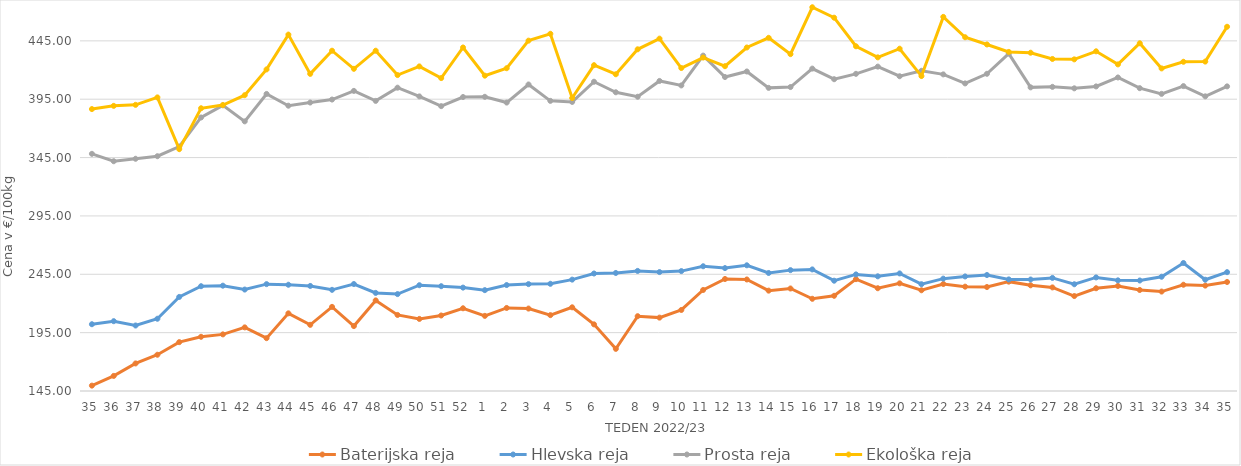
| Category | Baterijska reja | Hlevska reja | Prosta reja | Ekološka reja |
|---|---|---|---|---|
| 35.0 | 149.6 | 202.21 | 348.2 | 386.55 |
| 36.0 | 157.93 | 204.81 | 341.85 | 389.31 |
| 37.0 | 168.61 | 201.11 | 343.97 | 390.17 |
| 38.0 | 176.07 | 206.91 | 346.16 | 396.55 |
| 39.0 | 186.86 | 225.6 | 354.41 | 352.24 |
| 40.0 | 191.45 | 234.79 | 379.35 | 387.24 |
| 41.0 | 193.52 | 235.24 | 389.75 | 390 |
| 42.0 | 199.51 | 231.92 | 376.02 | 398.45 |
| 43.0 | 190.28 | 236.56 | 399.51 | 420.52 |
| 44.0 | 211.53 | 236.04 | 389.44 | 450.35 |
| 45.0 | 201.69 | 235.01 | 392.15 | 416.72 |
| 46.0 | 217.08 | 231.68 | 394.71 | 436.55 |
| 47.0 | 200.62 | 236.65 | 402.12 | 421.03 |
| 48.0 | 222.61 | 229.05 | 393.56 | 436.55 |
| 49.0 | 210.16 | 228.03 | 404.87 | 415.69 |
| 50.0 | 206.76 | 235.63 | 397.4 | 423.1 |
| 51.0 | 209.69 | 234.79 | 389.05 | 413.1 |
| 52.0 | 215.87 | 233.58 | 396.87 | 439.31 |
| 1.0 | 209.37 | 231.41 | 397.04 | 415.17 |
| 2.0 | 216.15 | 235.78 | 392.13 | 421.55 |
| 3.0 | 215.63 | 236.58 | 407.61 | 445.17 |
| 4.0 | 210 | 236.85 | 393.58 | 451.04 |
| 5.0 | 216.7 | 240.42 | 392.67 | 396.03 |
| 6.0 | 202.1 | 245.67 | 409.97 | 424.14 |
| 7.0 | 181.11 | 246.12 | 400.94 | 416.38 |
| 8.0 | 209.08 | 247.88 | 397.11 | 437.76 |
| 9.0 | 207.87 | 246.89 | 410.64 | 446.9 |
| 10.0 | 214.42 | 247.73 | 406.8 | 421.72 |
| 11.0 | 231.56 | 251.88 | 432.34 | 430.69 |
| 12.0 | 240.97 | 250.3 | 414 | 423.28 |
| 13.0 | 240.55 | 252.7 | 418.74 | 439.31 |
| 14.0 | 230.99 | 246.12 | 404.72 | 447.59 |
| 15.0 | 232.82 | 248.56 | 405.42 | 433.62 |
| 16.0 | 224 | 249.17 | 421.22 | 473.79 |
| 17.0 | 226.57 | 239.5 | 412.13 | 464.83 |
| 18.0 | 240.83 | 244.89 | 416.74 | 440.35 |
| 19.0 | 233.05 | 243.26 | 422.93 | 430.86 |
| 20.0 | 237.25 | 245.73 | 414.68 | 438.28 |
| 21.0 | 231.3 | 236.5 | 419.36 | 414.83 |
| 22.0 | 236.67 | 241.27 | 416.27 | 465.52 |
| 23.0 | 234.39 | 243.16 | 408.53 | 448.1 |
| 24.0 | 234.08 | 244.37 | 416.78 | 441.9 |
| 25.0 | 238.69 | 240.6 | 434.05 | 435.52 |
| 26.0 | 235.57 | 240.51 | 405.15 | 434.83 |
| 27.0 | 233.75 | 241.89 | 405.58 | 429.48 |
| 28.0 | 226.35 | 236.46 | 404.32 | 429.14 |
| 29.0 | 233.03 | 242.31 | 405.96 | 436.04 |
| 30.0 | 235 | 239.8 | 413.63 | 424.83 |
| 31.0 | 231.55 | 239.67 | 404.46 | 442.93 |
| 32.0 | 230.2 | 242.89 | 399.57 | 421.38 |
| 33.0 | 236.04 | 254.68 | 406.23 | 427.07 |
| 34.0 | 235.32 | 240.35 | 397.45 | 427.24 |
| 35.0 | 238.39 | 246.82 | 406 | 457.07 |